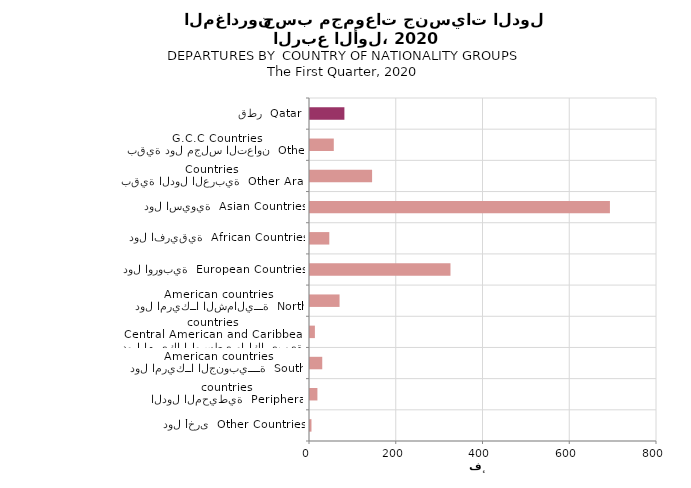
| Category | Series 0 |
|---|---|
| دول أخرى  Other Countries | 3377 |
| الدول المحيطية  Peripheral countries | 17084 |
| دول امريكــا الجنوبيــــة  South American countries | 28230 |
| دول امريكا الوسطى والكاريبية  Central American and Caribbean countries | 11277 |
| دول امريكــا الشماليـــة  North American countries  | 68154 |
| دول اوروبية  European Countries | 323865 |
| دول افريقية  African Countries | 44488 |
| دول اسيوية  Asian Countries | 691468 |
| بقية الدول العربية  Other Arab Countries | 143147 |
| بقية دول مجلس التعاون  Other G.C.C Countries | 54855 |
| قطر  Qatar | 79312 |